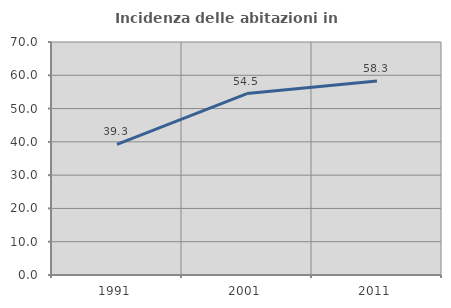
| Category | Incidenza delle abitazioni in proprietà  |
|---|---|
| 1991.0 | 39.264 |
| 2001.0 | 54.52 |
| 2011.0 | 58.313 |